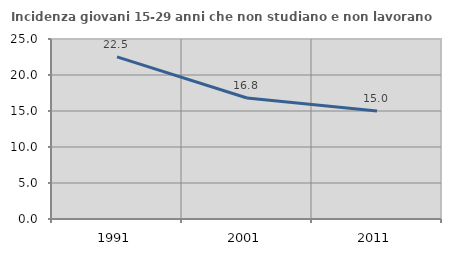
| Category | Incidenza giovani 15-29 anni che non studiano e non lavorano  |
|---|---|
| 1991.0 | 22.513 |
| 2001.0 | 16.807 |
| 2011.0 | 15 |